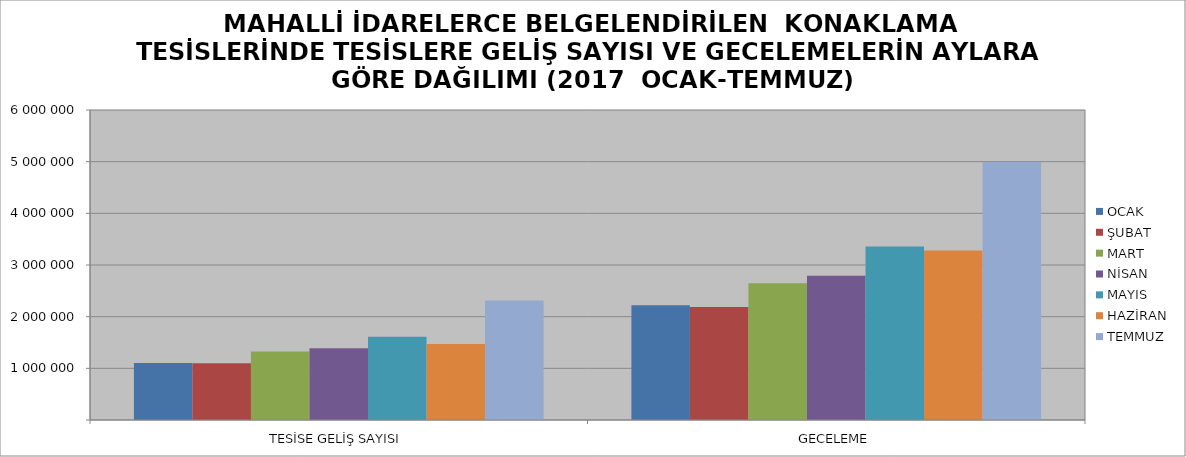
| Category | OCAK | ŞUBAT | MART | NİSAN | MAYIS | HAZİRAN | TEMMUZ |
|---|---|---|---|---|---|---|---|
| TESİSE GELİŞ SAYISI | 1104649 | 1099366 | 1327993 | 1389075 | 1611959 | 1472053 | 2311504 |
| GECELEME | 2222261 | 2187982 | 2645959 | 2791881 | 3355819 | 3280620 | 4994703 |